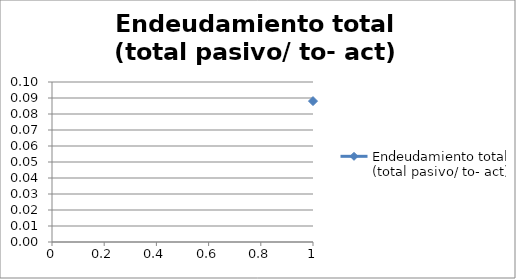
| Category | Endeudamiento total (total pasivo/ to- act) |
|---|---|
| 0 | 0.088 |
| 1 | 0.052 |
| 2 | 0.05 |
| 3 | 0.051 |
| 4 | 0.05 |
| 5 | 0.047 |
| 6 | 0.047 |
| 7 | 0.07 |